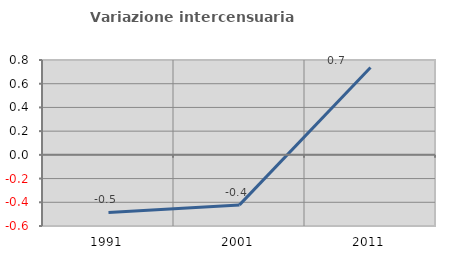
| Category | Variazione intercensuaria annua |
|---|---|
| 1991.0 | -0.485 |
| 2001.0 | -0.422 |
| 2011.0 | 0.736 |